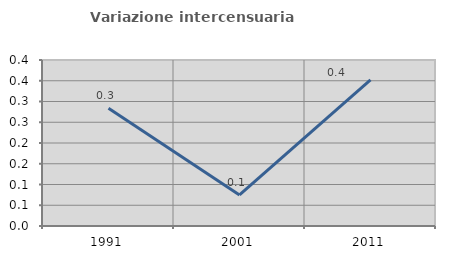
| Category | Variazione intercensuaria annua |
|---|---|
| 1991.0 | 0.284 |
| 2001.0 | 0.075 |
| 2011.0 | 0.352 |